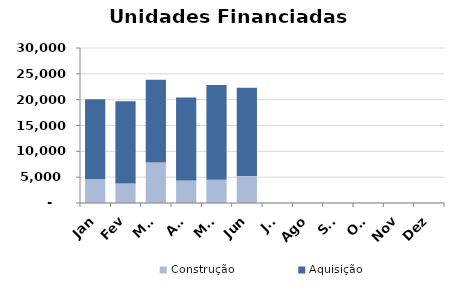
| Category | Construção | Aquisição  |
|---|---|---|
| Jan | 4588 | 15500 |
| Fev | 3778 | 15917 |
| Mar | 7819 | 16035 |
| Abr | 4377 | 16062 |
| Mai | 4499 | 18329 |
| Jun | 5207 | 17091 |
| Jul | 0 | 0 |
| Ago | 0 | 0 |
| Set | 0 | 0 |
| Out | 0 | 0 |
| Nov | 0 | 0 |
| Dez | 0 | 0 |